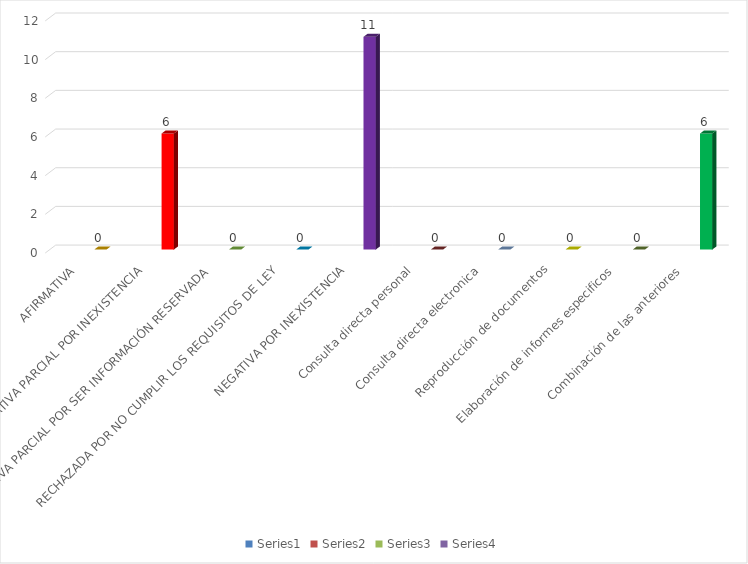
| Category | Series 0 | Series 1 | Series 2 | Series 3 |
|---|---|---|---|---|
| AFIRMATIVA |  |  |  | 0 |
| AFIRMATIVA PARCIAL POR INEXISTENCIA |  |  |  | 6 |
| AFIRMATIVA PARCIAL POR SER INFORMACIÓN RESERVADA |  |  |  | 0 |
| RECHAZADA POR NO CUMPLIR LOS REQUISITOS DE LEY |  |  |  | 0 |
| NEGATIVA POR INEXISTENCIA |  |  |  | 11 |
| Consulta directa personal |  |  |  | 0 |
| Consulta directa electronica |  |  |  | 0 |
| Reproducción de documentos |  |  |  | 0 |
| Elaboración de informes especificos |  |  |  | 0 |
| Combinación de las anteriores |  |  |  | 6 |